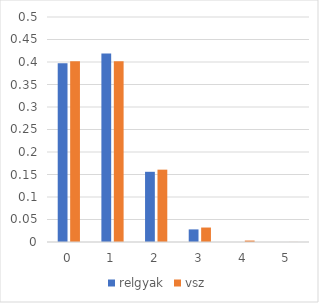
| Category | relgyak | vsz |
|---|---|---|
| 0.0 | 0.397 | 0.402 |
| 1.0 | 0.419 | 0.402 |
| 2.0 | 0.156 | 0.161 |
| 3.0 | 0.028 | 0.032 |
| 4.0 | 0 | 0.003 |
| 5.0 | 0 | 0 |